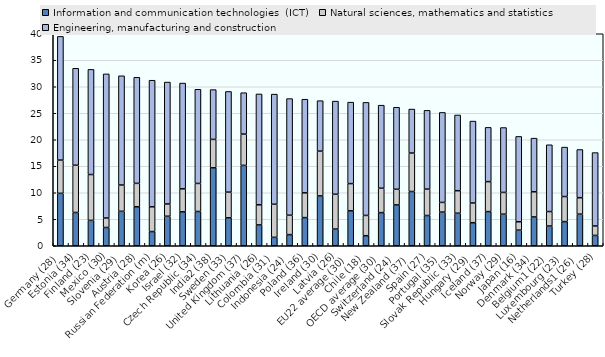
| Category | Information and communication technologies  (ICT) | Natural sciences, mathematics and statistics | Engineering, manufacturing and construction |
|---|---|---|---|
| Germany (28) | 9.894 | 6.269 | 23.342 |
| Estonia (34) | 6.277 | 8.911 | 18.298 |
| Finland (23) | 4.791 | 8.647 | 19.84 |
| Mexico (30) | 3.448 | 1.783 | 27.197 |
| Slovenia (29) | 6.499 | 4.96 | 20.612 |
| Austria (28) | 7.352 | 4.421 | 20.012 |
| Russian Federation (m) | 2.674 | 4.68 | 23.88 |
| Korea (26) | 5.566 | 2.317 | 23.001 |
| Israel (32) | 6.403 | 4.337 | 19.958 |
| Czech Republic (34) | 6.466 | 5.293 | 17.763 |
| India2 (38) | 14.706 | 5.356 | 9.399 |
| Sweden (33) | 5.272 | 4.845 | 18.994 |
| United Kingdom (37) | 15.164 | 5.9 | 7.813 |
| Lithuania (26) | 3.932 | 3.793 | 20.92 |
| Colombia (31) | 1.589 | 6.242 | 20.78 |
| Indonesia (24) | 2.102 | 3.652 | 22.012 |
| Poland (36) | 5.31 | 4.671 | 17.668 |
| Ireland (30) | 9.401 | 8.451 | 9.52 |
| Latvia (26) | 3.144 | 6.576 | 17.569 |
| EU22 average (30) | 6.592 | 5.135 | 15.366 |
| Chile (18) | 1.899 | 3.825 | 21.325 |
| OECD average (30) | 6.254 | 4.604 | 15.668 |
| Switzerland (24) | 7.709 | 2.95 | 15.475 |
| New Zealand (37) | 10.236 | 7.255 | 8.3 |
| Spain (27) | 5.709 | 4.975 | 14.865 |
| Portugal (35) | 6.353 | 1.823 | 16.981 |
| Slovak Republic (33) | 6.138 | 4.248 | 14.292 |
| Hungary (29) | 4.35 | 3.719 | 15.454 |
| Iceland (37) | 6.447 | 5.653 | 10.235 |
| Norway (29) | 5.954 | 4.106 | 12.245 |
| Japan (16) | 2.947 | 1.58 | 16.104 |
| Denmark (34) | 5.436 | 4.749 | 10.119 |
| Belgium1 (22) | 3.723 | 2.728 | 12.602 |
| Luxembourg (23) | 4.557 | 4.727 | 9.327 |
| Netherlands1 (26) | 5.965 | 3.102 | 9.091 |
| Turkey (28) | 1.951 | 1.781 | 13.85 |